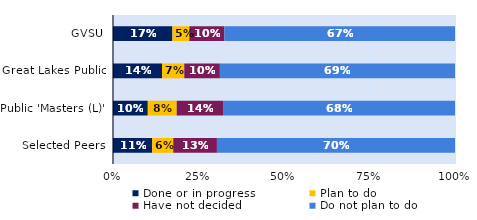
| Category | Done or in progress | Plan to do | Have not decided | Do not plan to do |
|---|---|---|---|---|
| GVSU | 0.174 | 0.05 | 0.102 | 0.674 |
| Great Lakes Public | 0.143 | 0.065 | 0.104 | 0.687 |
| Public 'Masters (L)' | 0.102 | 0.085 | 0.135 | 0.678 |
| Selected Peers | 0.115 | 0.062 | 0.128 | 0.696 |